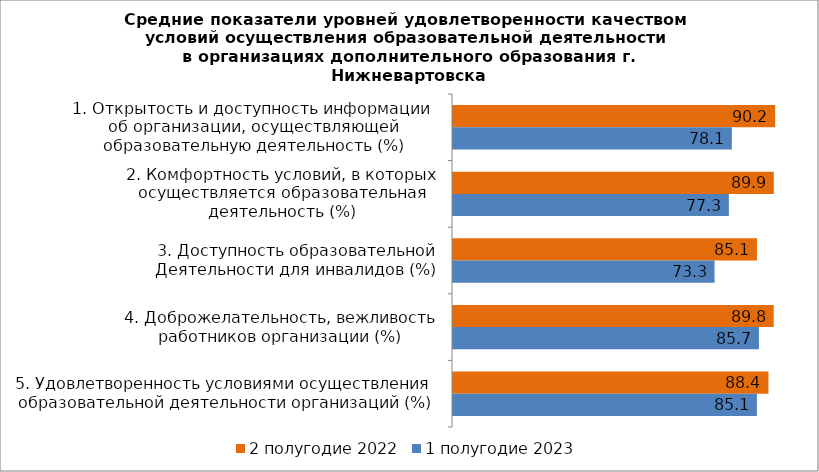
| Category | 2 полугодие 2022 | 1 полугодие 2023 |
|---|---|---|
| 1. Открытость и доступность информации 
об организации, осуществляющей
образовательную деятельность (%) | 90.24 | 78.105 |
| 2. Комфортность условий, в которых
осуществляется образовательная
деятельность (%) | 89.855 | 77.275 |
| 3. Доступность образовательной
Деятельности для инвалидов (%) | 85.145 | 73.26 |
| 4. Доброжелательность, вежливость
работников организации (%) | 89.825 | 85.705 |
| 5. Удовлетворенность условиями осуществления 
образовательной деятельности организаций (%) | 88.365 | 85.13 |